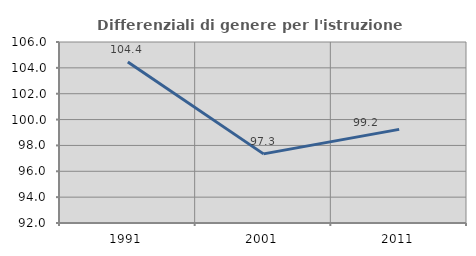
| Category | Differenziali di genere per l'istruzione superiore |
|---|---|
| 1991.0 | 104.447 |
| 2001.0 | 97.346 |
| 2011.0 | 99.242 |